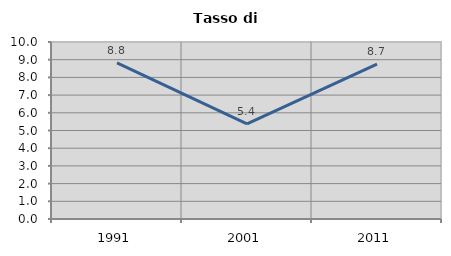
| Category | Tasso di disoccupazione   |
|---|---|
| 1991.0 | 8.815 |
| 2001.0 | 5.372 |
| 2011.0 | 8.747 |